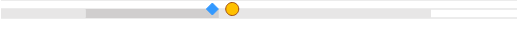
| Category | left | mid start | mid end | right |
|---|---|---|---|---|
| 0 | 0 | 0.197 | 0.31 | 0.493 |